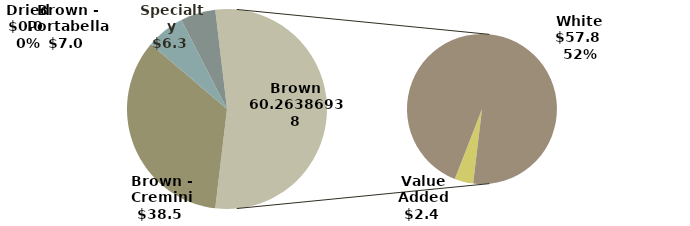
| Category | Brown |
|---|---|
| Brown - Cremini | 38.509 |
| Brown - Portabella | 6.972 |
| Dried | 0.008 |
| Specialty | 6.349 |
| Value Added | 2.428 |
| White | 57.835 |